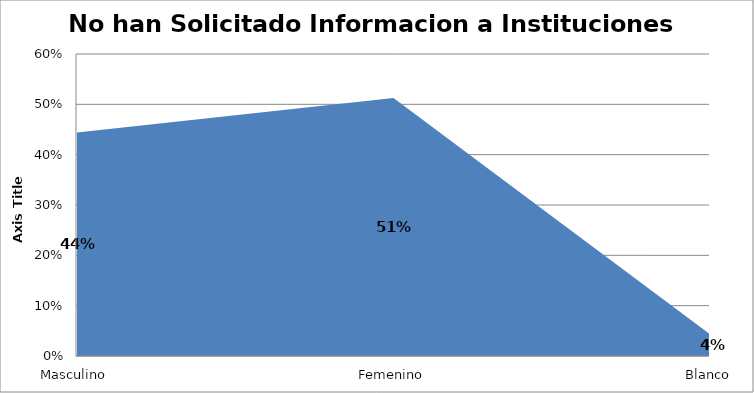
| Category | Series 0 |
|---|---|
| Masculino | 0.444 |
| Femenino | 0.513 |
| Blanco | 0.043 |